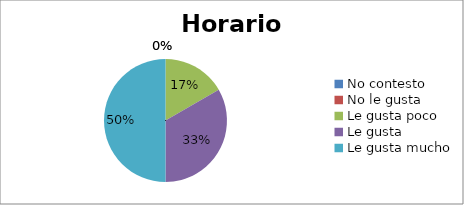
| Category | Series 0 |
|---|---|
| No contesto | 0 |
| No le gusta | 0 |
| Le gusta poco | 1 |
| Le gusta | 2 |
| Le gusta mucho | 3 |